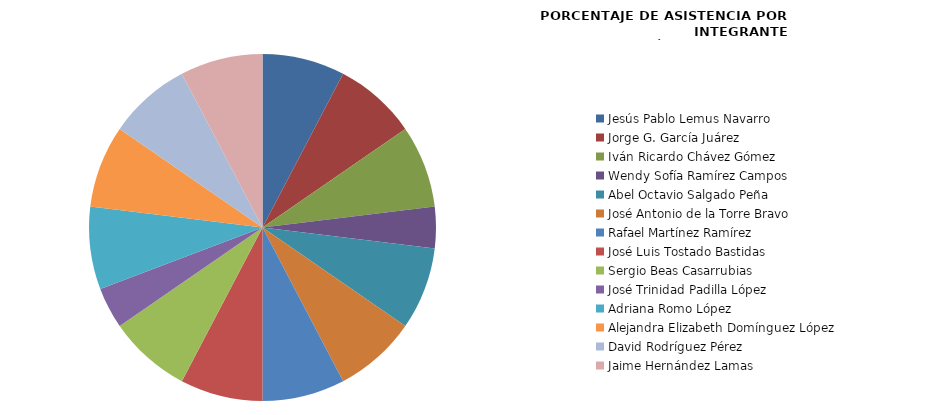
| Category | Series 0 |
|---|---|
| Jesús Pablo Lemus Navarro | 100 |
| Jorge G. García Juárez | 100 |
| Iván Ricardo Chávez Gómez | 100 |
| Wendy Sofía Ramírez Campos | 50 |
| Abel Octavio Salgado Peña | 100 |
| José Antonio de la Torre Bravo | 100 |
| Rafael Martínez Ramírez | 100 |
| José Luis Tostado Bastidas | 100 |
| Sergio Beas Casarrubias | 100 |
| José Trinidad Padilla López | 50 |
| Adriana Romo López | 100 |
| Alejandra Elizabeth Domínguez López | 100 |
| David Rodríguez Pérez | 100 |
| Jaime Hernández Lamas | 100 |